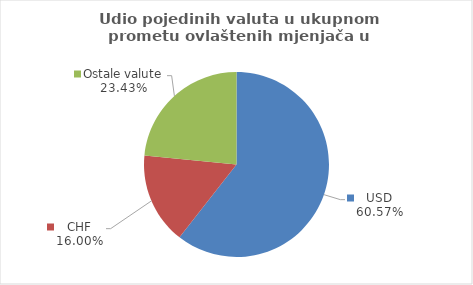
| Category | Series 0 |
|---|---|
| USD | 60.567 |
| CHF | 16.001 |
| Ostale valute | 23.433 |